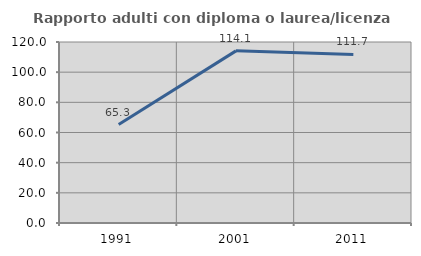
| Category | Rapporto adulti con diploma o laurea/licenza media  |
|---|---|
| 1991.0 | 65.269 |
| 2001.0 | 114.124 |
| 2011.0 | 111.735 |